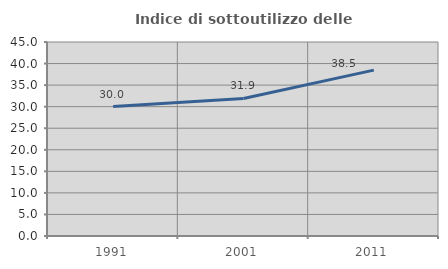
| Category | Indice di sottoutilizzo delle abitazioni  |
|---|---|
| 1991.0 | 30.033 |
| 2001.0 | 31.899 |
| 2011.0 | 38.482 |